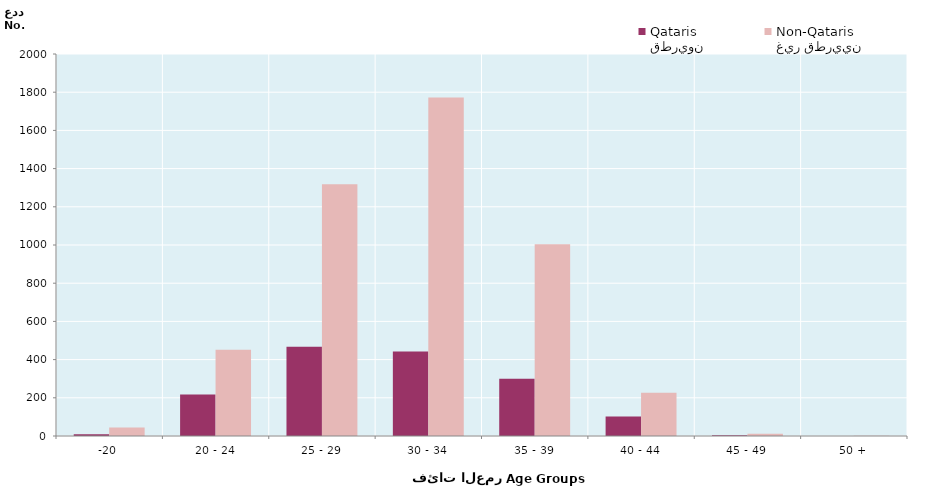
| Category | قطريون
Qataris | غير قطريين
Non-Qataris |
|---|---|---|
| -20 | 9 | 45 |
| 20 - 24 | 217 | 452 |
| 25 - 29 | 467 | 1318 |
| 30 - 34 | 443 | 1772 |
| 35 - 39 | 300 | 1004 |
| 40 - 44 | 102 | 227 |
| 45 - 49 | 4 | 12 |
| 50 + | 0 | 1 |